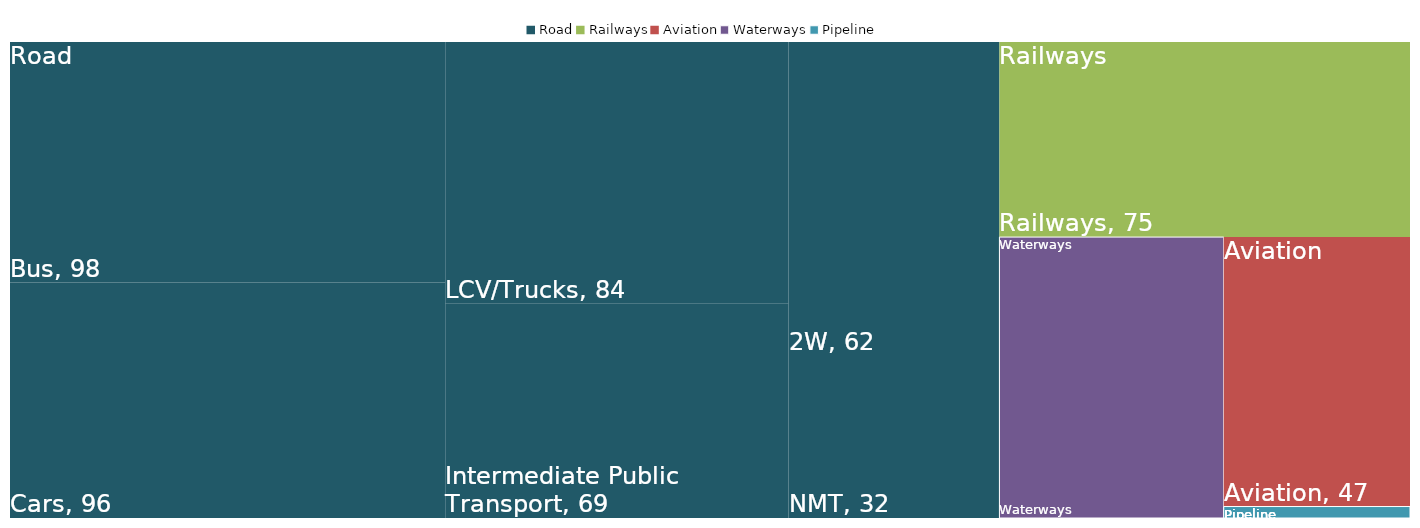
| Category | Series 0 |
|---|---|
| Multi-sector Assessment | 0.247 |
| Transport Emission Inventory | 0.227 |
| Transportation Policy/Strategy Analysis Tool | 0.5 |